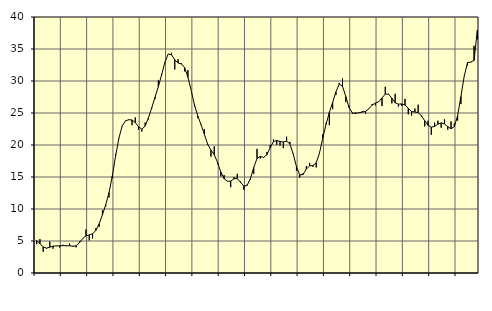
| Category | Piggar | Series 1 |
|---|---|---|
| nan | 4.5 | 5.07 |
| 87.0 | 5.3 | 4.58 |
| 87.0 | 3.3 | 4.08 |
| 87.0 | 3.8 | 3.89 |
| nan | 4.9 | 4.03 |
| 88.0 | 3.8 | 4.2 |
| 88.0 | 4.2 | 4.23 |
| 88.0 | 4 | 4.26 |
| nan | 4.4 | 4.28 |
| 89.0 | 4.2 | 4.27 |
| 89.0 | 4.6 | 4.25 |
| 89.0 | 4.1 | 4.19 |
| nan | 4 | 4.25 |
| 90.0 | 4.9 | 4.7 |
| 90.0 | 5.4 | 5.39 |
| 90.0 | 6.8 | 5.81 |
| nan | 5.1 | 5.95 |
| 91.0 | 5.4 | 6.14 |
| 91.0 | 7 | 6.64 |
| 91.0 | 7.2 | 7.68 |
| nan | 9.8 | 9.09 |
| 92.0 | 10.4 | 10.65 |
| 92.0 | 11.8 | 12.55 |
| 92.0 | 14.8 | 15.14 |
| nan | 18.6 | 18.26 |
| 93.0 | 21 | 21.06 |
| 93.0 | 23 | 22.94 |
| 93.0 | 23.8 | 23.77 |
| nan | 23.9 | 23.95 |
| 94.0 | 23.1 | 23.91 |
| 94.0 | 24.3 | 23.51 |
| 94.0 | 22.4 | 22.84 |
| nan | 22.1 | 22.46 |
| 95.0 | 23.5 | 22.98 |
| 95.0 | 24 | 24.25 |
| 95.0 | 25.7 | 25.82 |
| nan | 27.2 | 27.47 |
| 96.0 | 30.1 | 29.12 |
| 96.0 | 31.1 | 30.95 |
| 96.0 | 32.9 | 32.94 |
| nan | 34.2 | 34.22 |
| 97.0 | 34.4 | 34.1 |
| 97.0 | 31.8 | 33.31 |
| 97.0 | 33.4 | 32.81 |
| nan | 32.8 | 32.68 |
| 98.0 | 31.5 | 32.09 |
| 98.0 | 31.7 | 30.58 |
| 98.0 | 28.5 | 28.5 |
| nan | 26 | 26.23 |
| 99.0 | 24.2 | 24.52 |
| 99.0 | 23.1 | 23.18 |
| 99.0 | 22.5 | 21.67 |
| nan | 20 | 20.13 |
| 0.0 | 18.2 | 19.2 |
| 0.0 | 19.8 | 18.49 |
| 0.0 | 17 | 17.27 |
| nan | 15.1 | 15.78 |
| 1.0 | 15.3 | 14.73 |
| 1.0 | 14.3 | 14.33 |
| 1.0 | 13.4 | 14.36 |
| nan | 15 | 14.72 |
| 2.0 | 15.5 | 14.77 |
| 2.0 | 14.3 | 14.16 |
| 2.0 | 13 | 13.57 |
| nan | 13.8 | 13.69 |
| 3.0 | 14.6 | 14.76 |
| 3.0 | 15.5 | 16.48 |
| 3.0 | 19.4 | 17.88 |
| nan | 17.9 | 18.22 |
| 4.0 | 18 | 18.06 |
| 4.0 | 18.9 | 18.49 |
| 4.0 | 20 | 19.58 |
| nan | 20.9 | 20.52 |
| 5.0 | 20 | 20.71 |
| 5.0 | 19.9 | 20.55 |
| 5.0 | 19.5 | 20.48 |
| nan | 21.3 | 20.6 |
| 6.0 | 20.5 | 20.17 |
| 6.0 | 18.7 | 18.62 |
| 6.0 | 16 | 16.62 |
| nan | 14.9 | 15.34 |
| 7.0 | 15.6 | 15.38 |
| 7.0 | 16.7 | 16.23 |
| 7.0 | 17.2 | 16.75 |
| nan | 16.6 | 16.78 |
| 8.0 | 16.5 | 17.21 |
| 8.0 | 18.7 | 18.74 |
| 8.0 | 21.7 | 21.08 |
| nan | 23.4 | 23.23 |
| 9.0 | 23.1 | 25.1 |
| 9.0 | 25.6 | 26.66 |
| 9.0 | 27.8 | 28.31 |
| nan | 29.7 | 29.5 |
| 10.0 | 30.4 | 29.18 |
| 10.0 | 26.7 | 27.57 |
| 10.0 | 26.1 | 25.83 |
| nan | 24.9 | 25.01 |
| 11.0 | 25.1 | 24.94 |
| 11.0 | 25 | 25.04 |
| 11.0 | 25.3 | 25.13 |
| nan | 24.9 | 25.26 |
| 12.0 | 25.7 | 25.66 |
| 12.0 | 26.4 | 26.22 |
| 12.0 | 26.2 | 26.56 |
| nan | 26.8 | 26.75 |
| 13.0 | 26.1 | 27.36 |
| 13.0 | 29.1 | 27.95 |
| 13.0 | 28 | 27.93 |
| nan | 26.5 | 27.32 |
| 14.0 | 28 | 26.6 |
| 14.0 | 26 | 26.38 |
| 14.0 | 26.1 | 26.42 |
| nan | 27.2 | 26.24 |
| 15.0 | 24.8 | 25.73 |
| 15.0 | 24.6 | 25.23 |
| 15.0 | 25.7 | 25.14 |
| nan | 26.3 | 25.06 |
| 16.0 | 24.4 | 24.57 |
| 16.0 | 22.9 | 23.79 |
| 16.0 | 23.8 | 23.07 |
| nan | 21.6 | 22.79 |
| 17.0 | 23.5 | 22.91 |
| 17.0 | 23.8 | 23.27 |
| 17.0 | 22.7 | 23.46 |
| nan | 24 | 23.29 |
| 18.0 | 22.4 | 22.87 |
| 18.0 | 23.7 | 22.54 |
| 18.0 | 23.4 | 22.88 |
| nan | 23.8 | 24.6 |
| 19.0 | 26.4 | 27.57 |
| 19.0 | 30.7 | 30.73 |
| 19.0 | 32.4 | 32.88 |
| nan | 32.9 | 32.95 |
| 20.0 | 35.5 | 33.23 |
| 20.0 | 36.5 | 37.95 |